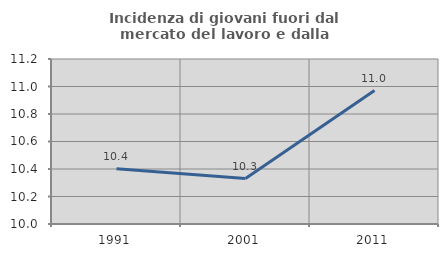
| Category | Incidenza di giovani fuori dal mercato del lavoro e dalla formazione  |
|---|---|
| 1991.0 | 10.403 |
| 2001.0 | 10.331 |
| 2011.0 | 10.97 |